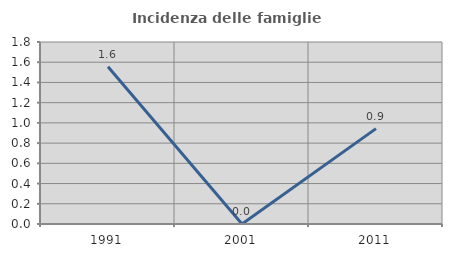
| Category | Incidenza delle famiglie numerose |
|---|---|
| 1991.0 | 1.554 |
| 2001.0 | 0 |
| 2011.0 | 0.943 |